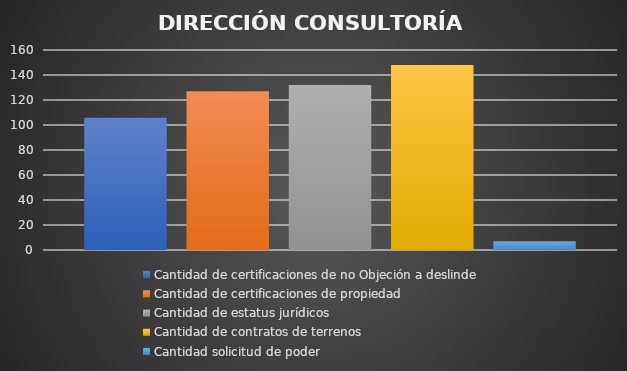
| Category | Cantidad de certificaciones de no Objeción a deslinde | Cantidad de certificaciones de propiedad | Cantidad de estatus jurídicos | Cantidad de contratos de terrenos | Cantidad solicitud de poder  |
|---|---|---|---|---|---|
| 0 | 106 | 127 | 132 | 148 | 7 |